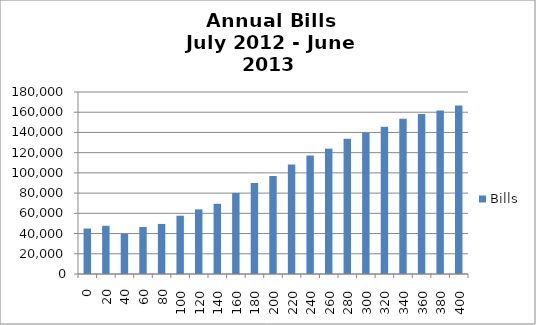
| Category | Bills |
|---|---|
| 0.0 | 44968.478 |
| 20.0 | 47668.77 |
| 40.0 | 39649.939 |
| 60.0 | 46489.332 |
| 80.0 | 49517.582 |
| 100.0 | 57656.993 |
| 120.0 | 63908.607 |
| 140.0 | 69434.001 |
| 160.0 | 80186.75 |
| 180.0 | 90042.073 |
| 200.0 | 96942.154 |
| 220.0 | 108300.711 |
| 240.0 | 117198.922 |
| 260.0 | 123969.433 |
| 280.0 | 133789.821 |
| 300.0 | 139586.082 |
| 320.0 | 145536.764 |
| 340.0 | 153561.513 |
| 360.0 | 158125.946 |
| 380.0 | 161822.398 |
| 400.0 | 166555.811 |